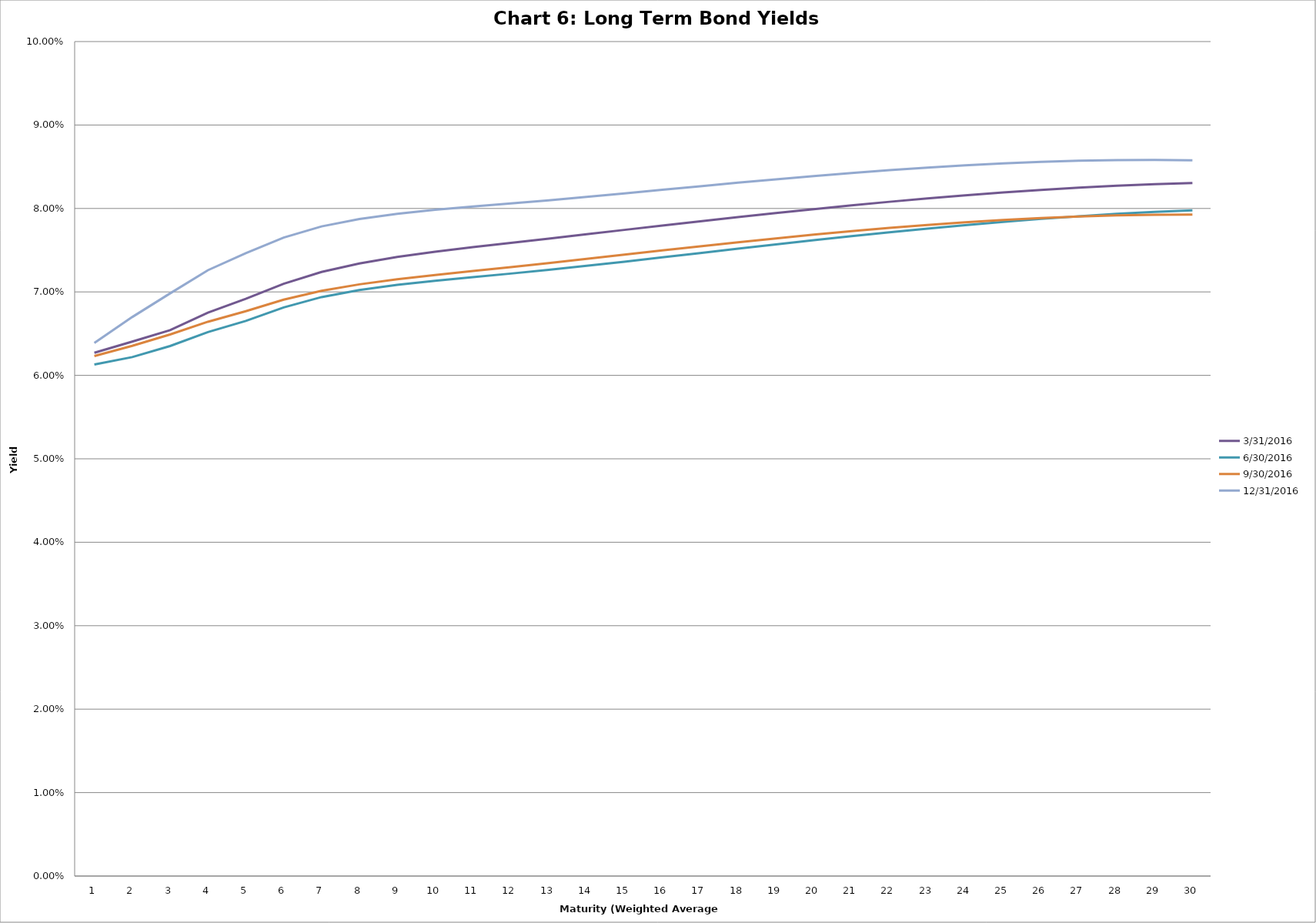
| Category | 3/31/2016 | 6/30/2016 | 9/30/2016 | 12/31/2016 |
|---|---|---|---|---|
| 0 | 0.063 | 0.061 | 0.062 | 0.064 |
| 1 | 0.064 | 0.062 | 0.064 | 0.067 |
| 2 | 0.065 | 0.064 | 0.065 | 0.07 |
| 3 | 0.068 | 0.065 | 0.066 | 0.073 |
| 4 | 0.069 | 0.067 | 0.068 | 0.075 |
| 5 | 0.071 | 0.068 | 0.069 | 0.077 |
| 6 | 0.072 | 0.069 | 0.07 | 0.078 |
| 7 | 0.073 | 0.07 | 0.071 | 0.079 |
| 8 | 0.074 | 0.071 | 0.072 | 0.079 |
| 9 | 0.075 | 0.071 | 0.072 | 0.08 |
| 10 | 0.075 | 0.072 | 0.073 | 0.08 |
| 11 | 0.076 | 0.072 | 0.073 | 0.081 |
| 12 | 0.076 | 0.073 | 0.073 | 0.081 |
| 13 | 0.077 | 0.073 | 0.074 | 0.081 |
| 14 | 0.077 | 0.074 | 0.074 | 0.082 |
| 15 | 0.078 | 0.074 | 0.075 | 0.082 |
| 16 | 0.078 | 0.075 | 0.075 | 0.083 |
| 17 | 0.079 | 0.075 | 0.076 | 0.083 |
| 18 | 0.079 | 0.076 | 0.076 | 0.083 |
| 19 | 0.08 | 0.076 | 0.077 | 0.084 |
| 20 | 0.08 | 0.077 | 0.077 | 0.084 |
| 21 | 0.081 | 0.077 | 0.078 | 0.085 |
| 22 | 0.081 | 0.078 | 0.078 | 0.085 |
| 23 | 0.082 | 0.078 | 0.078 | 0.085 |
| 24 | 0.082 | 0.078 | 0.079 | 0.085 |
| 25 | 0.082 | 0.079 | 0.079 | 0.086 |
| 26 | 0.082 | 0.079 | 0.079 | 0.086 |
| 27 | 0.083 | 0.079 | 0.079 | 0.086 |
| 28 | 0.083 | 0.08 | 0.079 | 0.086 |
| 29 | 0.083 | 0.08 | 0.079 | 0.086 |